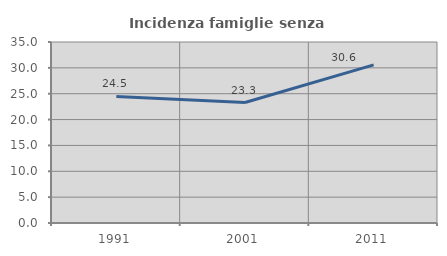
| Category | Incidenza famiglie senza nuclei |
|---|---|
| 1991.0 | 24.465 |
| 2001.0 | 23.291 |
| 2011.0 | 30.578 |